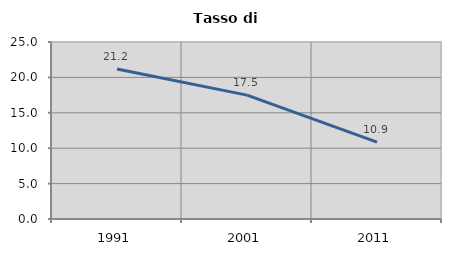
| Category | Tasso di disoccupazione   |
|---|---|
| 1991.0 | 21.176 |
| 2001.0 | 17.5 |
| 2011.0 | 10.87 |